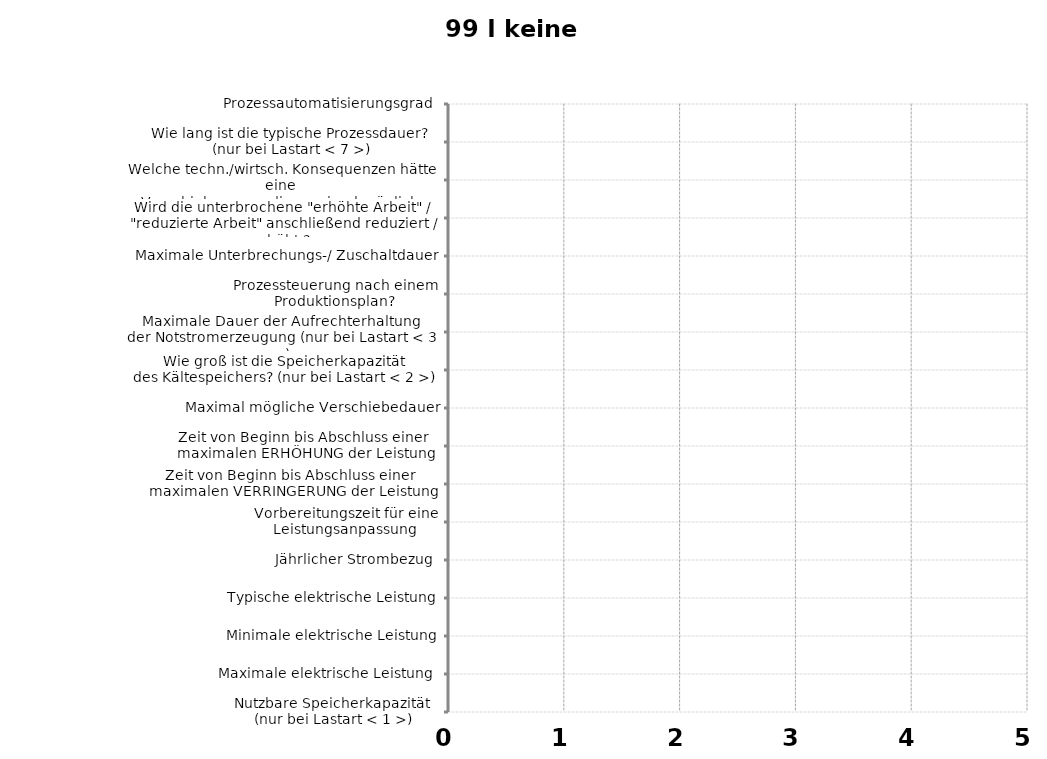
| Category | 99 I keine Zuordnung |
|---|---|
| Nutzbare Speicherkapazität 
(nur bei Lastart < 1 >) | 0 |
| Maximale elektrische Leistung  | 0 |
| Minimale elektrische Leistung | 0 |
| Typische elektrische Leistung | 0 |
| Jährlicher Strombezug  | 0 |
| Vorbereitungszeit für eine Leistungsanpassung | 0 |
| Zeit von Beginn bis Abschluss einer 
maximalen VERRINGERUNG der Leistung | 0 |
| Zeit von Beginn bis Abschluss einer 
maximalen ERHÖHUNG der Leistung | 0 |
| Maximal mögliche Verschiebedauer | 0 |
| Wie groß ist die Speicherkapazität 
des Kältespeichers? (nur bei Lastart < 2 >) | 0 |
| Maximale Dauer der Aufrechterhaltung 
der Notstromerzeugung (nur bei Lastart < 3 >) | 0 |
| Prozessteuerung nach einem Produktionsplan? | 0 |
| Maximale Unterbrechungs-/ Zuschaltdauer | 0 |
| Wird die unterbrochene "erhöhte Arbeit" / 
"reduzierte Arbeit" anschließend reduziert / erhöht ?  | 0 |
| Welche techn./wirtsch. Konsequenzen hätte eine 
Verschiebung um die maximal mögliche Verschiebedauer ? | 0 |
| Wie lang ist die typische Prozessdauer? 
(nur bei Lastart < 7 >) | 0 |
| Prozessautomatisierungsgrad  | 0 |